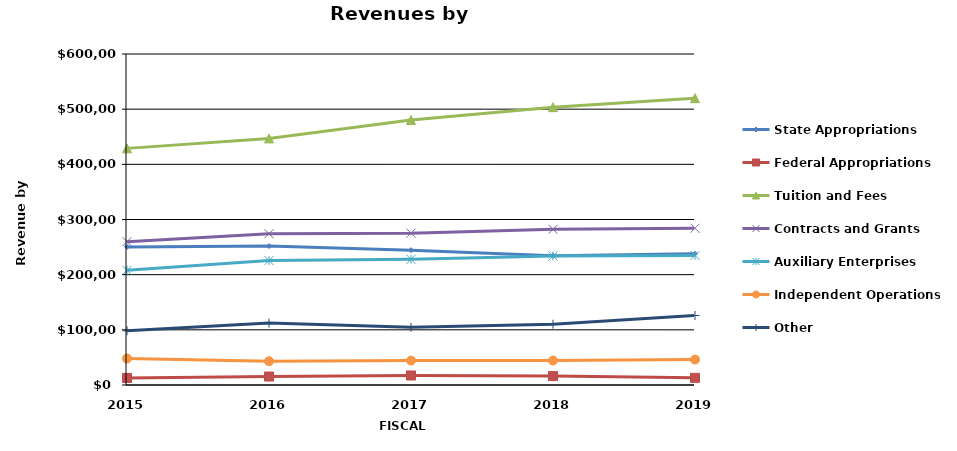
| Category | State Appropriations | Federal Appropriations | Tuition and Fees | Contracts and Grants | Auxiliary Enterprises | Independent Operations | Other |
|---|---|---|---|---|---|---|---|
| 2015.0 | 250354 | 12730 | 428932 | 259827 | 207932 | 48100 | 98268 |
| 2016.0 | 251782 | 15367 | 446954 | 274325 | 225621 | 43048 | 112234 |
| 2017.0 | 244458 | 17255 | 480293 | 275261 | 227892 | 44315 | 104559 |
| 2018.0 | 234396 | 16158 | 503619 | 282266 | 233870 | 44335 | 110270 |
| 2019.0 | 237884 | 12972 | 520006 | 284080 | 234846 | 46139 | 125959 |